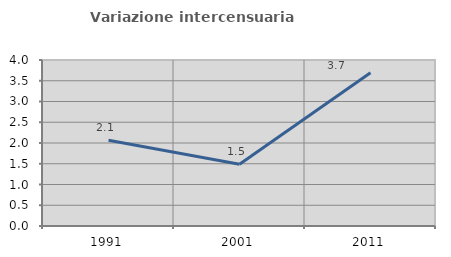
| Category | Variazione intercensuaria annua |
|---|---|
| 1991.0 | 2.066 |
| 2001.0 | 1.489 |
| 2011.0 | 3.692 |